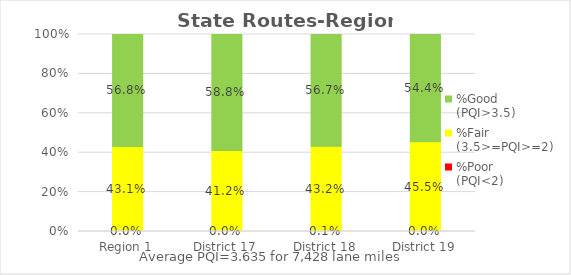
| Category | %Poor
(PQI<2) | %Fair
(3.5>=PQI>=2) | %Good
(PQI>3.5) |
|---|---|---|---|
| Region 1 | 0 | 0.431 | 0.568 |
| District 17 | 0 | 0.412 | 0.588 |
| District 18 | 0.001 | 0.432 | 0.567 |
| District 19 | 0 | 0.455 | 0.544 |